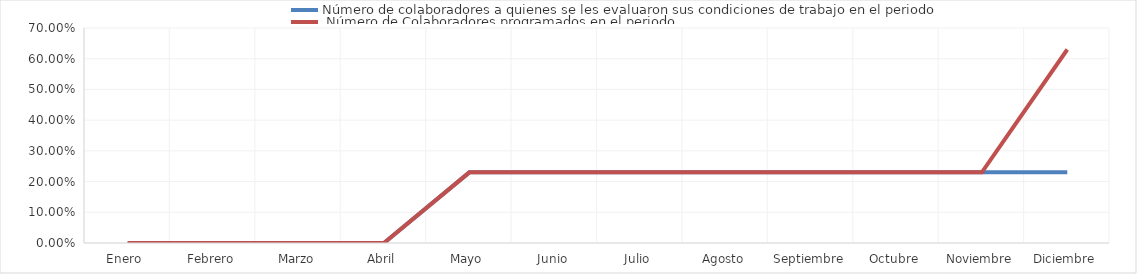
| Category | Número de colaboradores a quienes se les evaluaron sus condiciones de trabajo en el periodo |  Número de Colaboradores programados en el periodo |
|---|---|---|
| Enero  | 0 | 0 |
| Febrero | 0 | 0 |
| Marzo | 0 | 0 |
| Abril | 0 | 0 |
| Mayo | 0.23 | 0.23 |
| Junio | 0.23 | 0.23 |
| Julio | 0.23 | 0.23 |
| Agosto | 0.23 | 0.23 |
| Septiembre | 0.23 | 0.23 |
| Octubre | 0.23 | 0.23 |
| Noviembre | 0.23 | 0.23 |
| Diciembre | 0.23 | 0.63 |